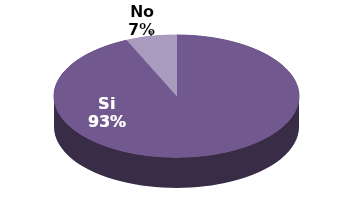
| Category | Series 1 |
|---|---|
| Si | 14 |
| No | 1 |